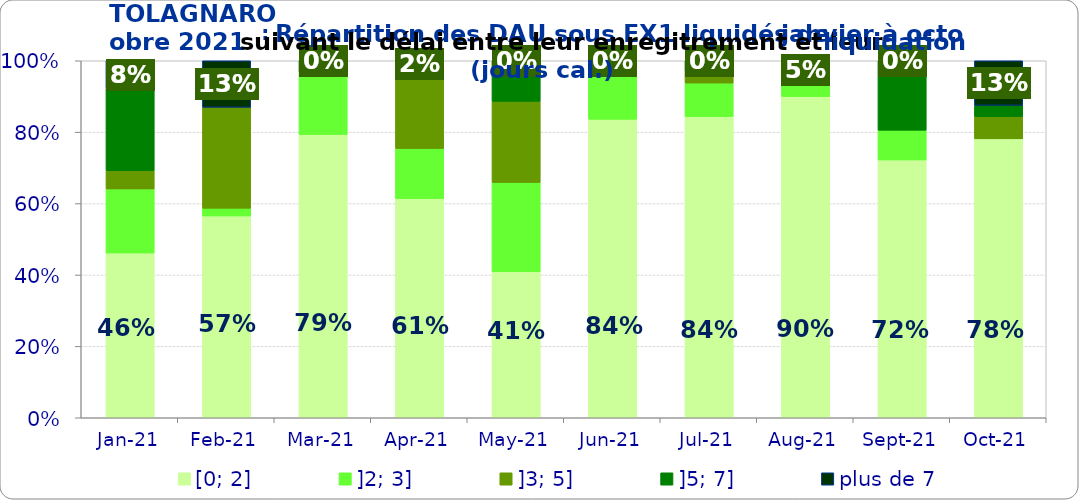
| Category | [0; 2] | ]2; 3] | ]3; 5] | ]5; 7] | plus de 7 |
|---|---|---|---|---|---|
| 2021-01-01 | 0.462 | 0.179 | 0.051 | 0.231 | 0.077 |
| 2021-02-01 | 0.565 | 0.022 | 0.283 | 0 | 0.13 |
| 2021-03-01 | 0.794 | 0.175 | 0 | 0.032 | 0 |
| 2021-04-01 | 0.614 | 0.14 | 0.228 | 0 | 0.018 |
| 2021-05-01 | 0.409 | 0.25 | 0.227 | 0.114 | 0 |
| 2021-06-01 | 0.836 | 0.148 | 0.016 | 0 | 0 |
| 2021-07-01 | 0.844 | 0.094 | 0.031 | 0.031 | 0 |
| 2021-08-01 | 0.9 | 0.05 | 0 | 0 | 0.05 |
| 2021-09-01 | 0.722 | 0.083 | 0 | 0.194 | 0 |
| 2021-10-01 | 0.781 | 0 | 0.062 | 0.031 | 0.125 |